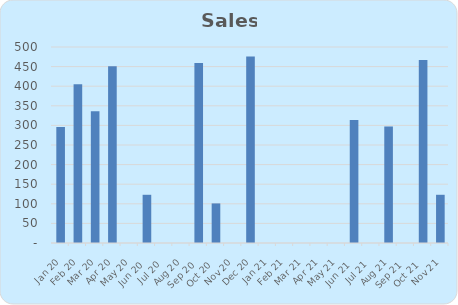
| Category | Sales |
|---|---|
| 2020-01-01 | 296 |
| 2020-02-01 | 405 |
| 2020-03-01 | 336 |
| 2020-04-01 | 451 |
| 2020-06-01 | 123 |
| 2020-09-01 | 459 |
| 2020-10-01 | 101 |
| 2020-12-01 | 476 |
| 2021-06-01 | 314 |
| 2021-08-01 | 297 |
| 2021-10-01 | 467 |
| 2021-11-01 | 123 |